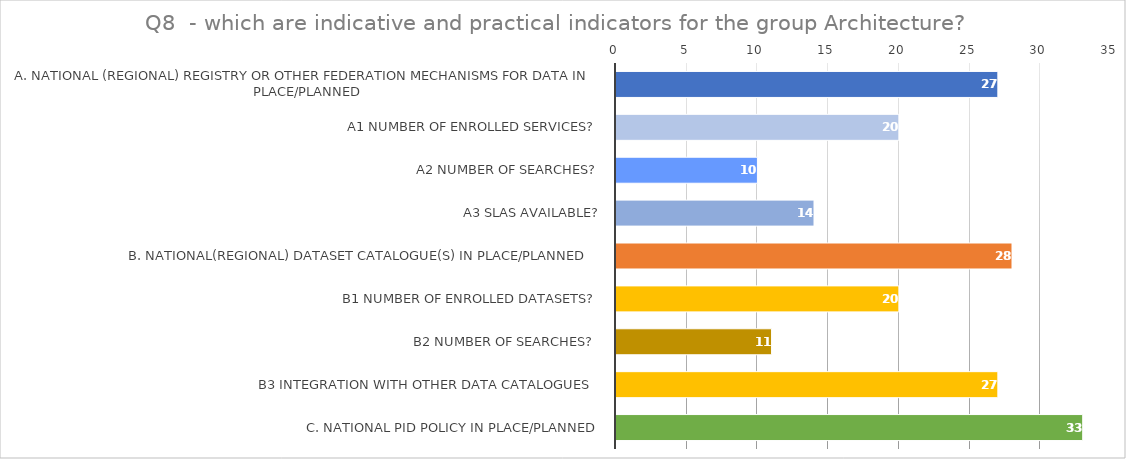
| Category | Series 0 |
|---|---|
| A. National (regional) registry or other federation mechanisms for data in place/planned | 27 |
| a1 Number of enrolled services? | 20 |
| a2 Number of searches? | 10 |
| a3 SLAs available? | 14 |
| B. National(regional) dataset catalogue(s) in place/planned  | 28 |
| b1 Number of enrolled datasets? | 20 |
| b2 Number of searches?  | 11 |
| b3 Integration with other data catalogues  | 27 |
| C. National PID policy in place/planned | 33 |